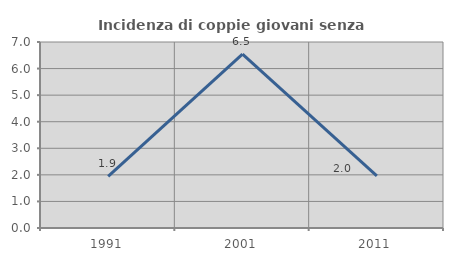
| Category | Incidenza di coppie giovani senza figli |
|---|---|
| 1991.0 | 1.942 |
| 2001.0 | 6.542 |
| 2011.0 | 1.961 |